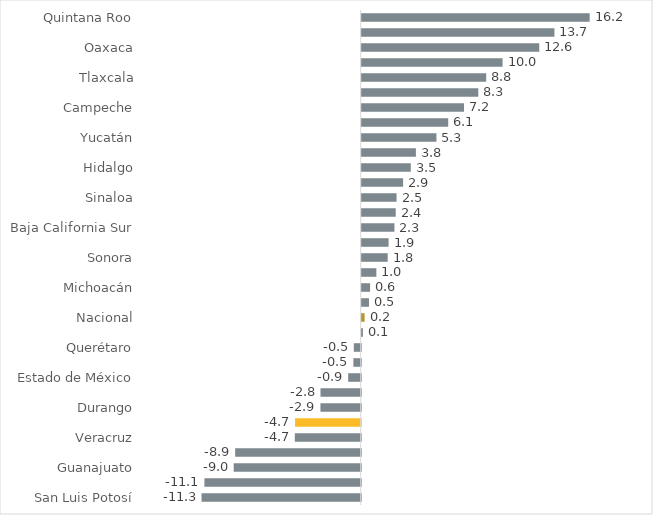
| Category | Series 0 |
|---|---|
| San Luis Potosí | -11.278 |
| Nayarit | -11.075 |
| Guanajuato | -8.999 |
| Chiapas | -8.895 |
| Veracruz | -4.668 |
| Jalisco | -4.651 |
| Durango | -2.853 |
| Colima | -2.848 |
| Estado de México | -0.889 |
| Ciudad de México | -0.52 |
| Querétaro | -0.491 |
| Coahuila | 0.084 |
| Nacional | 0.206 |
| Tamaulipas | 0.514 |
| Michoacán | 0.592 |
| Morelos | 1.037 |
| Sonora | 1.84 |
| Guerrero | 1.905 |
| Baja California Sur | 2.318 |
| Puebla | 2.41 |
| Sinaloa | 2.47 |
| Tabasco | 2.933 |
| Hidalgo | 3.476 |
| Chihuahua | 3.839 |
| Yucatán | 5.294 |
| Nuevo León | 6.128 |
| Campeche | 7.247 |
| Baja California | 8.26 |
| Tlaxcala | 8.821 |
| Zacatecas | 9.978 |
| Oaxaca | 12.579 |
| Aguascalientes | 13.654 |
| Quintana Roo | 16.151 |